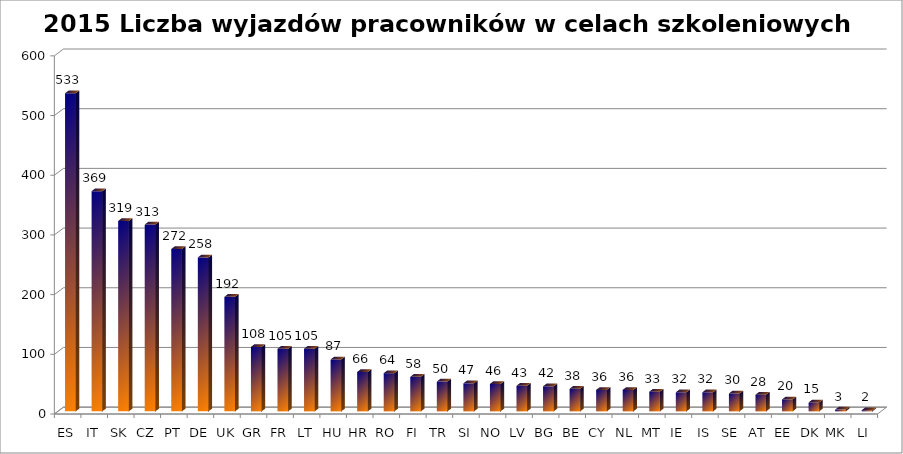
| Category | Liczba wyjazdów pracowników w celach szkoleniowych (STT) |
|---|---|
| ES | 533 |
| IT | 369 |
| SK | 319 |
| CZ | 313 |
| PT | 272 |
| DE | 258 |
| UK | 192 |
| GR | 108 |
| FR | 105 |
| LT | 105 |
| HU | 87 |
| HR | 66 |
| RO | 64 |
| FI | 58 |
| TR | 50 |
| SI | 47 |
| NO | 46 |
| LV | 43 |
| BG | 42 |
| BE | 38 |
| CY | 36 |
| NL | 36 |
| MT | 33 |
| IE | 32 |
| IS | 32 |
| SE | 30 |
| AT | 28 |
| EE | 20 |
| DK | 15 |
| MK | 3 |
| LI | 2 |